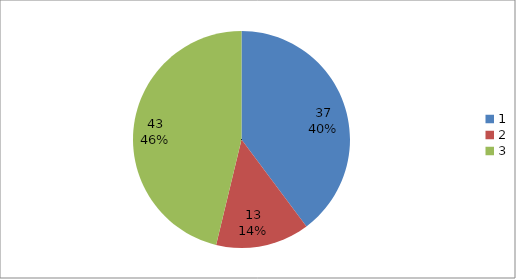
| Category | Series 0 |
|---|---|
| 0 | 37 |
| 1 | 13 |
| 2 | 43 |